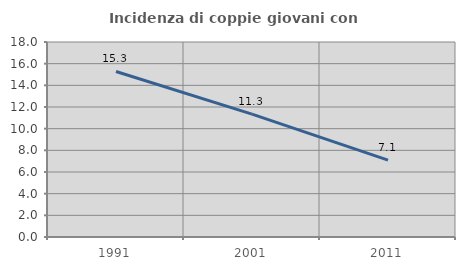
| Category | Incidenza di coppie giovani con figli |
|---|---|
| 1991.0 | 15.28 |
| 2001.0 | 11.34 |
| 2011.0 | 7.1 |